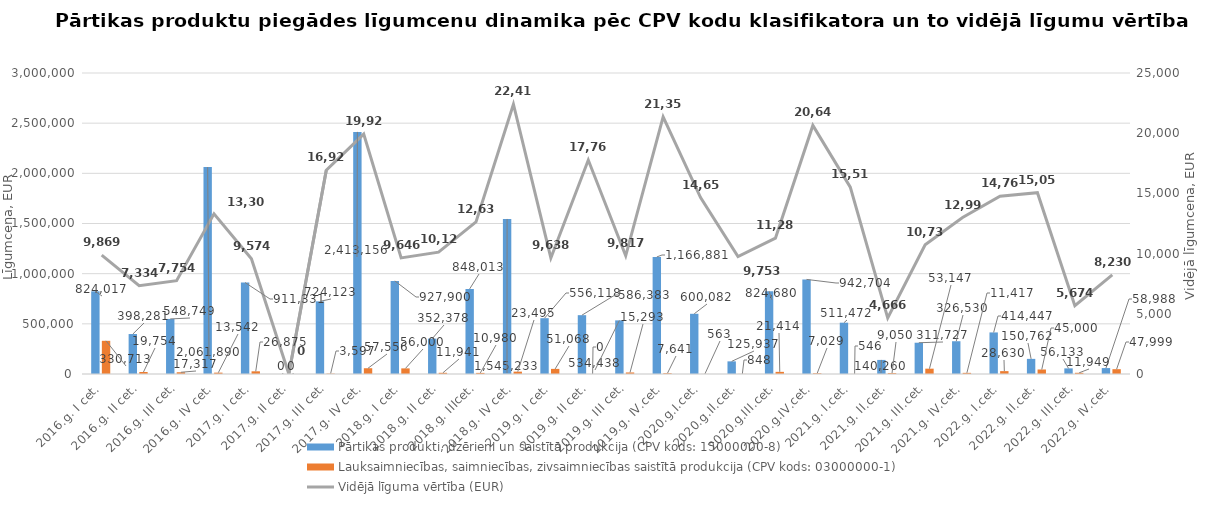
| Category | Pārtikas produkti, dzērieni un saistītā produkcija (CPV kods: 15000000-8) | Lauksaimniecības, saimniecības, zivsaimniecības saistītā produkcija (CPV kods: 03000000-1) |
|---|---|---|
| 2016.g. I cet. | 824017 | 330713 |
| 2016.g. II cet. | 398281 | 19754 |
| 2016.g. III cet. | 548749.01 | 17317 |
| 2016.g. IV cet. | 2061890 | 13542 |
| 2017.g. I cet. | 911330.81 | 26874.91 |
| 2017.g. II cet. | 0 | 0 |
| 2017.g. III cet. | 724123.07 | 3596.6 |
| 2017.g. IV cet. | 2413156 | 57556 |
| 2018.g. I cet. | 927900 | 56000 |
| 2018.g. II cet. | 352378 | 11941 |
| 2018.g. IIIcet. | 848013 | 10980 |
| 2018.g. IV cet. | 1545233 | 23495 |
| 2019.g. I cet. | 556118 | 51068 |
| 2019.g. II cet. | 586383 | 0 |
| 2019.g. III cet. | 534438 | 15293 |
| 2019.g. IV.cet. | 1166881 | 7641 |
| 2020.g.I.cet. | 600082 | 563 |
| 2020.g.II.cet. | 125937 | 848 |
| 2020.g.III.cet. | 824680 | 21414 |
| 2020.g.IV.cet. | 942704 | 7029 |
| 2021.g. I.cet. | 511472 | 546 |
| 2021.g. II.cet. | 140260 | 9050 |
| 2021.g. III.cet. | 311727 | 53147 |
| 2021.g. IV.cet. | 326530 | 11417 |
| 2022.g. I.cet. | 414447 | 28630 |
| 2022.g. II.cet. | 150762 | 45000 |
| 2022.g. III.cet. | 56133 | 11949 |
| 2022.g. IV.cet. | 58988 | 47999 |